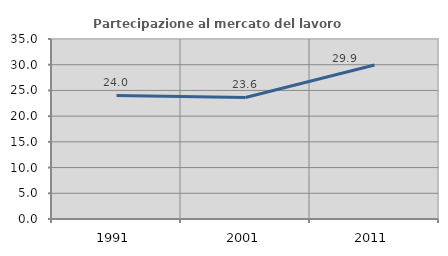
| Category | Partecipazione al mercato del lavoro  femminile |
|---|---|
| 1991.0 | 24.027 |
| 2001.0 | 23.636 |
| 2011.0 | 29.944 |